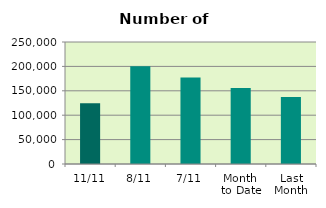
| Category | Series 0 |
|---|---|
| 11/11 | 124246 |
| 8/11 | 200490 |
| 7/11 | 177316 |
| Month 
to Date | 155652 |
| Last
Month | 137122.087 |